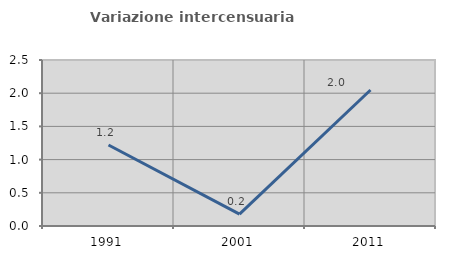
| Category | Variazione intercensuaria annua |
|---|---|
| 1991.0 | 1.22 |
| 2001.0 | 0.18 |
| 2011.0 | 2.049 |